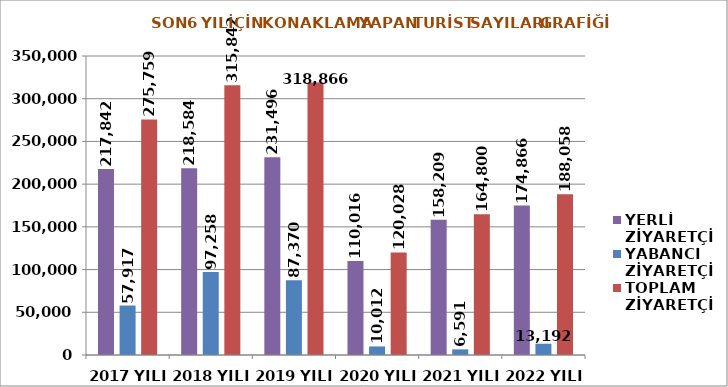
| Category | YERLİ ZİYARETÇİ | YABANCI ZİYARETÇİ | TOPLAM ZİYARETÇİ |
|---|---|---|---|
| 2017 YILI | 217842 | 57917 | 275759 |
| 2018 YILI | 218584 | 97258 | 315842 |
| 2019 YILI  | 231496 | 87370 | 318866 |
| 2020 YILI  | 110016 | 10012 | 120028 |
| 2021 YILI  | 158209 | 6591 | 164800 |
| 2022 YILI  | 174866 | 13192 | 188058 |